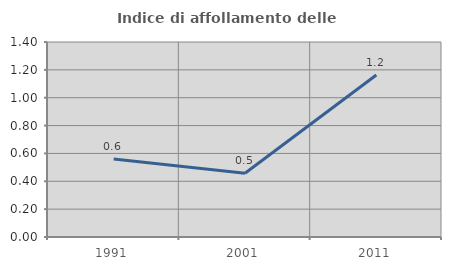
| Category | Indice di affollamento delle abitazioni  |
|---|---|
| 1991.0 | 0.561 |
| 2001.0 | 0.457 |
| 2011.0 | 1.163 |